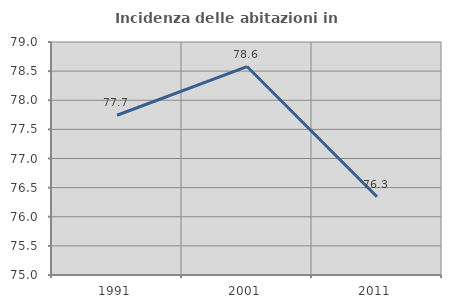
| Category | Incidenza delle abitazioni in proprietà  |
|---|---|
| 1991.0 | 77.743 |
| 2001.0 | 78.579 |
| 2011.0 | 76.344 |